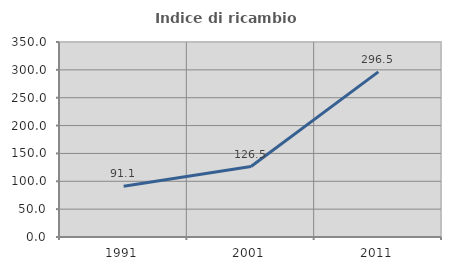
| Category | Indice di ricambio occupazionale  |
|---|---|
| 1991.0 | 91.089 |
| 2001.0 | 126.531 |
| 2011.0 | 296.46 |